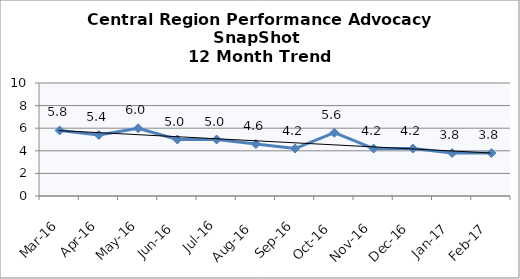
| Category | Central Region |
|---|---|
| Mar-16 | 5.8 |
| Apr-16 | 5.4 |
| May-16 | 6 |
| Jun-16 | 5 |
| Jul-16 | 5 |
| Aug-16 | 4.6 |
| Sep-16 | 4.2 |
| Oct-16 | 5.6 |
| Nov-16 | 4.2 |
| Dec-16 | 4.2 |
| Jan-17 | 3.8 |
| Feb-17 | 3.8 |